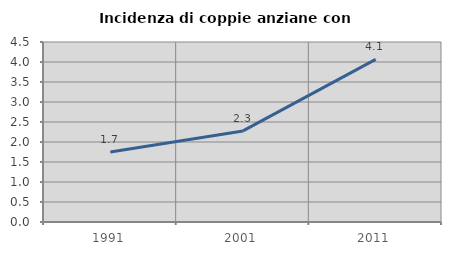
| Category | Incidenza di coppie anziane con figli |
|---|---|
| 1991.0 | 1.749 |
| 2001.0 | 2.277 |
| 2011.0 | 4.066 |